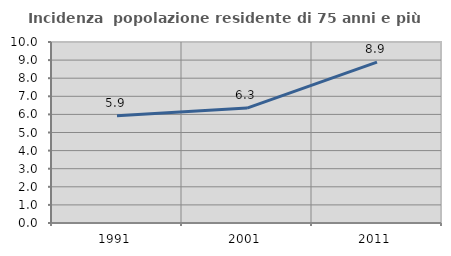
| Category | Incidenza  popolazione residente di 75 anni e più |
|---|---|
| 1991.0 | 5.922 |
| 2001.0 | 6.347 |
| 2011.0 | 8.887 |